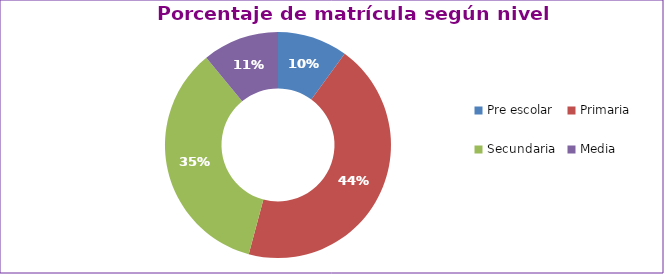
| Category | Series 0 |
|---|---|
| Pre escolar | 0.1 |
| Primaria | 0.441 |
| Secundaria | 0.349 |
| Media | 0.109 |